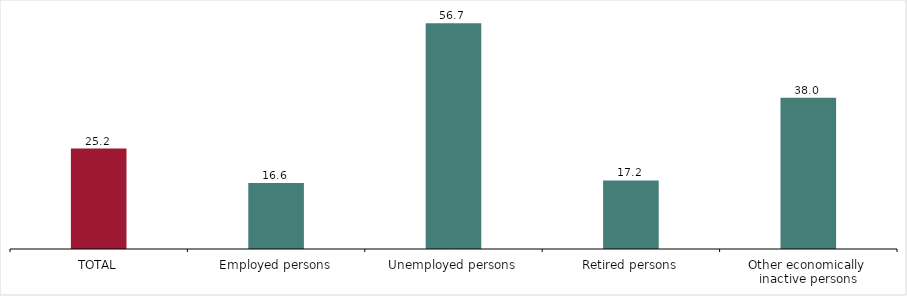
| Category | Por relación con la actividad |
|---|---|
| TOTAL | 25.2 |
| Employed persons | 16.6 |
| Unemployed persons | 56.7 |
| Retired persons | 17.2 |
| Other economically 
inactive persons | 38 |